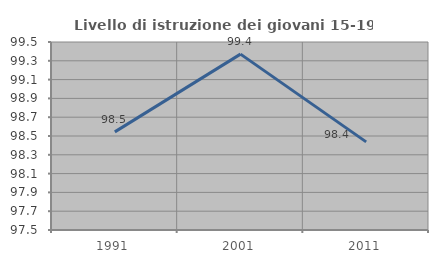
| Category | Livello di istruzione dei giovani 15-19 anni |
|---|---|
| 1991.0 | 98.544 |
| 2001.0 | 99.371 |
| 2011.0 | 98.438 |